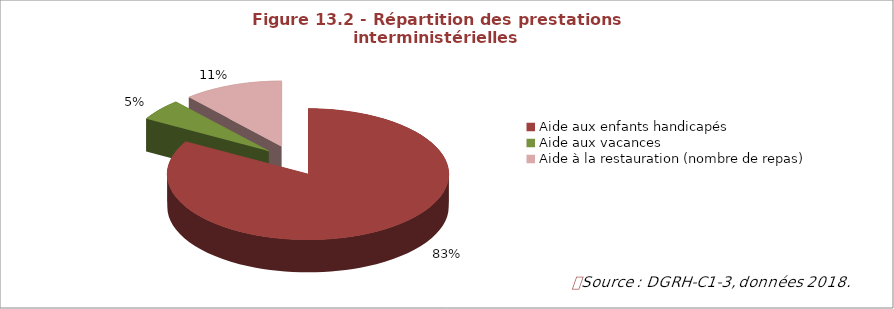
| Category | Figure 10.2 - Répartition des prestations interministérielles (tous programmes) par type, en 2015 |
|---|---|
| Aide aux enfants handicapés | 0.832 |
| Aide aux vacances | 0.053 |
| Aide à la restauration (nombre de repas) | 0.115 |